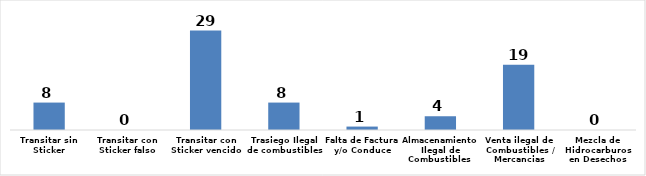
| Category | Series 0 |
|---|---|
| Transitar sin Sticker | 8 |
| Transitar con Sticker falso | 0 |
| Transitar con Sticker vencido | 29 |
| Trasiego Ilegal de combustibles  | 8 |
| Falta de Factura y/o Conduce | 1 |
| Almacenamiento Ilegal de Combustibles  | 4 |
| Venta ilegal de Combustibles / Mercancias | 19 |
| Mezcla de Hidrocarburos en Desechos | 0 |